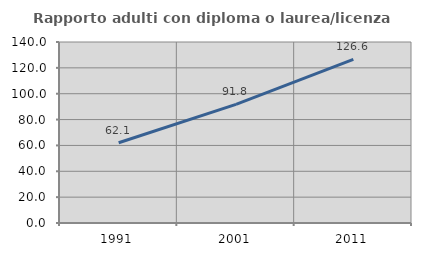
| Category | Rapporto adulti con diploma o laurea/licenza media  |
|---|---|
| 1991.0 | 62.069 |
| 2001.0 | 91.765 |
| 2011.0 | 126.582 |